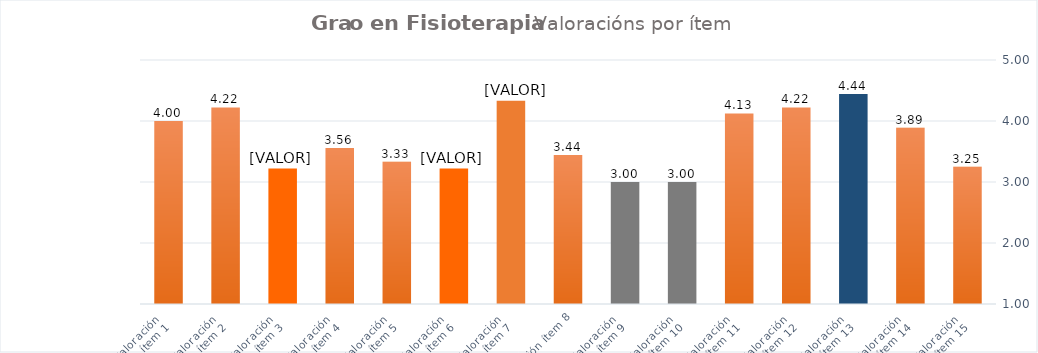
| Category | Series 0 |
|---|---|
| Valoración 
ítem 1 | 4 |
| Valoración 
ítem 2 | 4.222 |
| Valoración 
ítem 3 | 3.222 |
| Valoración 
ítem 4 | 3.556 |
| Valoración 
ítem 5 | 3.333 |
| Valoración 
ítem 6 | 3.222 |
| Valoración 
ítem 7 | 4.333 |
| Valoración ítem 8 | 3.444 |
| Valoración 
ítem 9 | 3 |
| Valoración 
ítem 10 | 3 |
| Valoración 
ítem 11 | 4.125 |
| Valoración 
ítem 12 | 4.222 |
| Valoración 
ítem 13 | 4.444 |
| Valoración 
ítem 14 | 3.889 |
| Valoración 
ítem 15 | 3.25 |